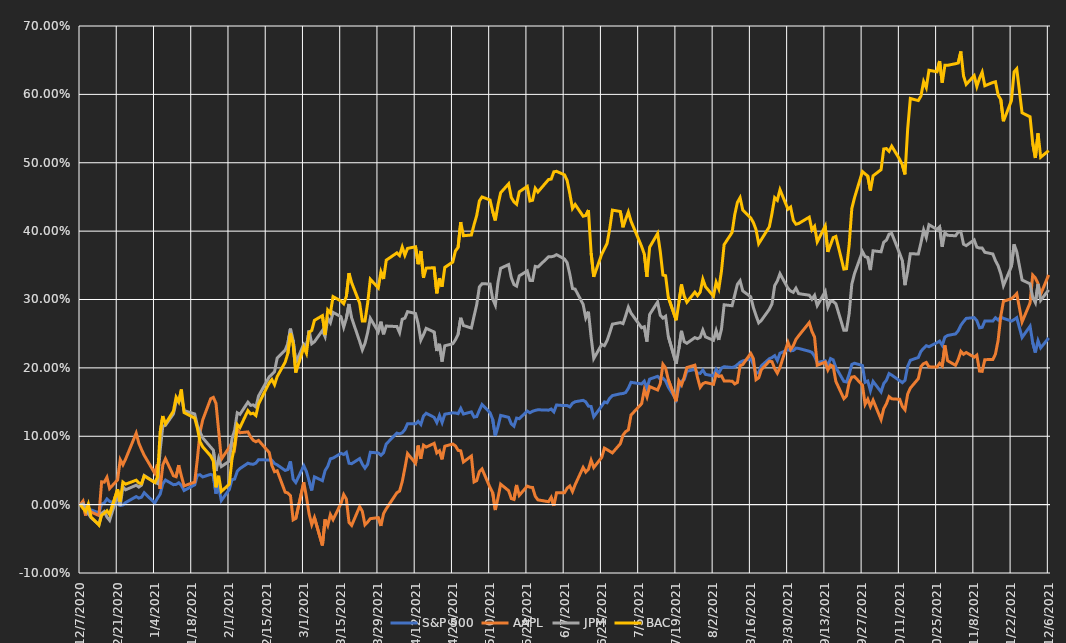
| Category | S&P 500 | AAPL | JPM | BAC |
|---|---|---|---|---|
| 12/6/21 | 0.244 | 0.336 | 0.314 | 0.518 |
| 12/3/21 | 0.229 | 0.308 | 0.299 | 0.508 |
| 12/2/21 | 0.24 | 0.323 | 0.323 | 0.543 |
| 12/1/21 | 0.222 | 0.331 | 0.295 | 0.507 |
| 11/30/21 | 0.237 | 0.336 | 0.303 | 0.529 |
| 11/29/21 | 0.261 | 0.295 | 0.323 | 0.567 |
| 11/26/21 | 0.244 | 0.267 | 0.329 | 0.573 |
| 11/24/21 | 0.273 | 0.309 | 0.37 | 0.637 |
| 11/23/21 | 0.271 | 0.304 | 0.381 | 0.633 |
| 11/22/21 | 0.268 | 0.301 | 0.348 | 0.591 |
| 11/19/21 | 0.272 | 0.297 | 0.32 | 0.561 |
| 11/18/21 | 0.274 | 0.276 | 0.338 | 0.592 |
| 11/17/21 | 0.27 | 0.24 | 0.349 | 0.599 |
| 11/16/21 | 0.273 | 0.22 | 0.357 | 0.618 |
| 11/15/21 | 0.268 | 0.212 | 0.367 | 0.617 |
| 11/12/21 | 0.268 | 0.212 | 0.369 | 0.613 |
| 11/11/21 | 0.259 | 0.195 | 0.375 | 0.633 |
| 11/10/21 | 0.259 | 0.195 | 0.375 | 0.624 |
| 11/9/21 | 0.269 | 0.219 | 0.377 | 0.612 |
| 11/8/21 | 0.273 | 0.216 | 0.387 | 0.627 |
| 11/5/21 | 0.272 | 0.222 | 0.379 | 0.615 |
| 11/4/21 | 0.268 | 0.22 | 0.381 | 0.627 |
| 11/3/21 | 0.262 | 0.224 | 0.399 | 0.663 |
| 11/2/21 | 0.254 | 0.212 | 0.399 | 0.646 |
| 11/1/21 | 0.25 | 0.204 | 0.393 | 0.645 |
| 10/29/21 | 0.247 | 0.211 | 0.394 | 0.642 |
| 10/28/21 | 0.245 | 0.233 | 0.398 | 0.642 |
| 10/27/21 | 0.233 | 0.203 | 0.377 | 0.617 |
| 10/26/21 | 0.239 | 0.207 | 0.406 | 0.649 |
| 10/25/21 | 0.237 | 0.201 | 0.403 | 0.633 |
| 10/22/21 | 0.231 | 0.202 | 0.409 | 0.635 |
| 10/21/21 | 0.232 | 0.208 | 0.391 | 0.61 |
| 10/20/21 | 0.229 | 0.206 | 0.402 | 0.619 |
| 10/19/21 | 0.224 | 0.202 | 0.383 | 0.598 |
| 10/18/21 | 0.215 | 0.184 | 0.367 | 0.591 |
| 10/15/21 | 0.211 | 0.17 | 0.367 | 0.594 |
| 10/14/21 | 0.202 | 0.162 | 0.341 | 0.549 |
| 10/13/21 | 0.182 | 0.139 | 0.321 | 0.483 |
| 10/12/21 | 0.178 | 0.144 | 0.357 | 0.497 |
| 10/11/21 | 0.181 | 0.154 | 0.367 | 0.505 |
| 10/8/21 | 0.189 | 0.155 | 0.397 | 0.524 |
| 10/7/21 | 0.192 | 0.158 | 0.396 | 0.517 |
| 10/6/21 | 0.182 | 0.147 | 0.387 | 0.521 |
| 10/5/21 | 0.177 | 0.14 | 0.384 | 0.52 |
| 10/4/21 | 0.165 | 0.124 | 0.37 | 0.49 |
| 10/1/21 | 0.18 | 0.153 | 0.371 | 0.481 |
| 9/30/21 | 0.167 | 0.143 | 0.343 | 0.459 |
| 9/29/21 | 0.181 | 0.154 | 0.362 | 0.481 |
| 9/28/21 | 0.179 | 0.147 | 0.363 | 0.484 |
| 9/27/21 | 0.203 | 0.175 | 0.37 | 0.487 |
| 9/24/21 | 0.207 | 0.187 | 0.338 | 0.449 |
| 9/23/21 | 0.205 | 0.187 | 0.322 | 0.433 |
| 9/22/21 | 0.191 | 0.179 | 0.279 | 0.38 |
| 9/21/21 | 0.179 | 0.159 | 0.255 | 0.345 |
| 9/20/21 | 0.18 | 0.155 | 0.255 | 0.344 |
| 9/17/21 | 0.201 | 0.18 | 0.294 | 0.392 |
| 9/16/21 | 0.212 | 0.202 | 0.297 | 0.391 |
| 9/15/21 | 0.214 | 0.204 | 0.298 | 0.38 |
| 9/14/21 | 0.203 | 0.197 | 0.289 | 0.37 |
| 9/13/21 | 0.21 | 0.208 | 0.312 | 0.407 |
| 9/10/21 | 0.208 | 0.204 | 0.291 | 0.384 |
| 9/9/21 | 0.217 | 0.245 | 0.306 | 0.407 |
| 9/8/21 | 0.223 | 0.253 | 0.3 | 0.402 |
| 9/7/21 | 0.224 | 0.266 | 0.306 | 0.42 |
| 9/3/21 | 0.228 | 0.247 | 0.309 | 0.411 |
| 9/2/21 | 0.229 | 0.242 | 0.317 | 0.41 |
| 9/1/21 | 0.225 | 0.232 | 0.31 | 0.416 |
| 8/31/21 | 0.225 | 0.227 | 0.312 | 0.435 |
| 8/30/21 | 0.227 | 0.237 | 0.316 | 0.432 |
| 8/27/21 | 0.221 | 0.201 | 0.338 | 0.461 |
| 8/26/21 | 0.211 | 0.192 | 0.327 | 0.445 |
| 8/25/21 | 0.218 | 0.199 | 0.32 | 0.449 |
| 8/24/21 | 0.215 | 0.209 | 0.294 | 0.426 |
| 8/23/21 | 0.213 | 0.21 | 0.286 | 0.406 |
| 8/20/21 | 0.203 | 0.197 | 0.269 | 0.388 |
| 8/19/21 | 0.193 | 0.185 | 0.266 | 0.382 |
| 8/18/21 | 0.192 | 0.183 | 0.277 | 0.402 |
| 8/17/21 | 0.205 | 0.214 | 0.288 | 0.413 |
| 8/16/21 | 0.213 | 0.221 | 0.304 | 0.419 |
| 8/13/21 | 0.21 | 0.205 | 0.313 | 0.431 |
| 8/12/21 | 0.208 | 0.203 | 0.327 | 0.449 |
| 8/11/21 | 0.205 | 0.179 | 0.322 | 0.442 |
| 8/10/21 | 0.202 | 0.177 | 0.307 | 0.424 |
| 8/9/21 | 0.201 | 0.181 | 0.291 | 0.398 |
| 8/6/21 | 0.202 | 0.181 | 0.292 | 0.38 |
| 8/5/21 | 0.2 | 0.188 | 0.257 | 0.341 |
| 8/4/21 | 0.192 | 0.187 | 0.241 | 0.316 |
| 8/3/21 | 0.198 | 0.191 | 0.254 | 0.325 |
| 8/2/21 | 0.188 | 0.176 | 0.24 | 0.305 |
| 7/30/21 | 0.19 | 0.179 | 0.245 | 0.319 |
| 7/29/21 | 0.197 | 0.177 | 0.255 | 0.33 |
| 7/28/21 | 0.192 | 0.172 | 0.245 | 0.311 |
| 7/27/21 | 0.192 | 0.186 | 0.243 | 0.306 |
| 7/26/21 | 0.198 | 0.204 | 0.244 | 0.311 |
| 7/23/21 | 0.195 | 0.2 | 0.236 | 0.296 |
| 7/22/21 | 0.183 | 0.186 | 0.238 | 0.305 |
| 7/21/21 | 0.181 | 0.175 | 0.254 | 0.322 |
| 7/20/21 | 0.171 | 0.181 | 0.228 | 0.296 |
| 7/19/21 | 0.153 | 0.151 | 0.206 | 0.27 |
| 7/16/21 | 0.172 | 0.183 | 0.246 | 0.304 |
| 7/15/21 | 0.181 | 0.2 | 0.276 | 0.335 |
| 7/14/21 | 0.185 | 0.205 | 0.273 | 0.336 |
| 7/13/21 | 0.183 | 0.177 | 0.277 | 0.37 |
| 7/12/21 | 0.188 | 0.168 | 0.296 | 0.397 |
| 7/9/21 | 0.184 | 0.173 | 0.278 | 0.376 |
| 7/8/21 | 0.17 | 0.157 | 0.238 | 0.333 |
| 7/7/21 | 0.18 | 0.168 | 0.26 | 0.366 |
| 7/6/21 | 0.176 | 0.148 | 0.259 | 0.377 |
| 7/2/21 | 0.179 | 0.131 | 0.28 | 0.415 |
| 7/1/21 | 0.17 | 0.109 | 0.289 | 0.428 |
| 6/30/21 | 0.164 | 0.107 | 0.276 | 0.417 |
| 6/29/21 | 0.162 | 0.102 | 0.265 | 0.406 |
| 6/28/21 | 0.162 | 0.089 | 0.266 | 0.429 |
| 6/25/21 | 0.159 | 0.076 | 0.264 | 0.431 |
| 6/24/21 | 0.156 | 0.078 | 0.251 | 0.404 |
| 6/23/21 | 0.149 | 0.08 | 0.24 | 0.382 |
| 6/22/21 | 0.15 | 0.083 | 0.232 | 0.374 |
| 6/21/21 | 0.144 | 0.069 | 0.234 | 0.366 |
| 6/18/21 | 0.129 | 0.054 | 0.214 | 0.333 |
| 6/17/21 | 0.144 | 0.065 | 0.245 | 0.368 |
| 6/16/21 | 0.144 | 0.052 | 0.282 | 0.431 |
| 6/15/21 | 0.15 | 0.048 | 0.273 | 0.423 |
| 6/14/21 | 0.153 | 0.054 | 0.293 | 0.422 |
| 6/11/21 | 0.15 | 0.029 | 0.315 | 0.439 |
| 6/10/21 | 0.148 | 0.019 | 0.316 | 0.433 |
| 6/9/21 | 0.143 | 0.027 | 0.337 | 0.455 |
| 6/8/21 | 0.145 | 0.024 | 0.354 | 0.474 |
| 6/7/21 | 0.145 | 0.017 | 0.359 | 0.482 |
| 6/4/21 | 0.146 | 0.017 | 0.366 | 0.487 |
| 6/3/21 | 0.136 | -0.002 | 0.363 | 0.487 |
| 6/2/21 | 0.14 | 0.011 | 0.362 | 0.476 |
| 6/1/21 | 0.138 | 0.004 | 0.362 | 0.475 |
| 5/28/21 | 0.139 | 0.007 | 0.348 | 0.457 |
| 5/27/21 | 0.138 | 0.012 | 0.348 | 0.463 |
| 5/26/21 | 0.137 | 0.025 | 0.328 | 0.445 |
| 5/25/21 | 0.134 | 0.025 | 0.328 | 0.444 |
| 5/24/21 | 0.137 | 0.027 | 0.342 | 0.465 |
| 5/21/21 | 0.126 | 0.014 | 0.335 | 0.458 |
| 5/20/21 | 0.127 | 0.029 | 0.32 | 0.439 |
| 5/19/21 | 0.115 | 0.008 | 0.322 | 0.443 |
| 5/18/21 | 0.118 | 0.009 | 0.332 | 0.449 |
| 5/17/21 | 0.128 | 0.02 | 0.351 | 0.469 |
| 5/14/21 | 0.131 | 0.03 | 0.346 | 0.456 |
| 5/13/21 | 0.114 | 0.01 | 0.325 | 0.438 |
| 5/12/21 | 0.101 | -0.008 | 0.292 | 0.416 |
| 5/11/21 | 0.125 | 0.017 | 0.301 | 0.429 |
| 5/10/21 | 0.134 | 0.025 | 0.323 | 0.446 |
| 5/7/21 | 0.146 | 0.052 | 0.323 | 0.45 |
| 5/6/21 | 0.138 | 0.048 | 0.318 | 0.444 |
| 5/5/21 | 0.129 | 0.035 | 0.292 | 0.423 |
| 5/4/21 | 0.128 | 0.033 | 0.276 | 0.409 |
| 5/3/21 | 0.136 | 0.071 | 0.258 | 0.394 |
| 4/30/21 | 0.133 | 0.062 | 0.262 | 0.393 |
| 4/29/21 | 0.141 | 0.079 | 0.273 | 0.413 |
| 4/28/21 | 0.133 | 0.079 | 0.249 | 0.376 |
| 4/27/21 | 0.134 | 0.086 | 0.241 | 0.371 |
| 4/26/21 | 0.134 | 0.089 | 0.235 | 0.355 |
| 4/23/21 | 0.132 | 0.085 | 0.232 | 0.347 |
| 4/22/21 | 0.12 | 0.066 | 0.209 | 0.319 |
| 4/21/21 | 0.13 | 0.079 | 0.235 | 0.331 |
| 4/20/21 | 0.12 | 0.076 | 0.225 | 0.309 |
| 4/19/21 | 0.128 | 0.09 | 0.252 | 0.347 |
| 4/16/21 | 0.134 | 0.084 | 0.258 | 0.346 |
| 4/15/21 | 0.13 | 0.087 | 0.249 | 0.332 |
| 4/14/21 | 0.117 | 0.067 | 0.241 | 0.371 |
| 4/13/21 | 0.122 | 0.086 | 0.264 | 0.352 |
| 4/12/21 | 0.118 | 0.061 | 0.28 | 0.377 |
| 4/9/21 | 0.118 | 0.075 | 0.282 | 0.375 |
| 4/8/21 | 0.11 | 0.053 | 0.273 | 0.365 |
| 4/7/21 | 0.105 | 0.034 | 0.271 | 0.377 |
| 4/6/21 | 0.103 | 0.02 | 0.252 | 0.364 |
| 4/5/21 | 0.105 | 0.017 | 0.26 | 0.368 |
| 4/1/21 | 0.089 | -0.006 | 0.261 | 0.358 |
| 3/31/21 | 0.076 | -0.013 | 0.249 | 0.33 |
| 3/30/21 | 0.072 | -0.031 | 0.267 | 0.34 |
| 3/29/21 | 0.076 | -0.019 | 0.253 | 0.317 |
| 3/26/21 | 0.077 | -0.021 | 0.272 | 0.33 |
| 3/25/21 | 0.059 | -0.026 | 0.252 | 0.295 |
| 3/24/21 | 0.053 | -0.03 | 0.236 | 0.268 |
| 3/23/21 | 0.059 | -0.01 | 0.226 | 0.268 |
| 3/22/21 | 0.067 | -0.003 | 0.239 | 0.295 |
| 3/19/21 | 0.06 | -0.03 | 0.273 | 0.325 |
| 3/18/21 | 0.061 | -0.026 | 0.293 | 0.339 |
| 3/17/21 | 0.076 | 0.008 | 0.272 | 0.305 |
| 3/16/21 | 0.073 | 0.015 | 0.26 | 0.294 |
| 3/15/21 | 0.075 | 0.002 | 0.275 | 0.298 |
| 3/12/21 | 0.068 | -0.022 | 0.281 | 0.304 |
| 3/11/21 | 0.067 | -0.014 | 0.266 | 0.28 |
| 3/10/21 | 0.056 | -0.03 | 0.273 | 0.285 |
| 3/9/21 | 0.05 | -0.022 | 0.246 | 0.249 |
| 3/8/21 | 0.035 | -0.06 | 0.255 | 0.276 |
| 3/5/21 | 0.041 | -0.019 | 0.238 | 0.27 |
| 3/4/21 | 0.021 | -0.029 | 0.235 | 0.255 |
| 3/3/21 | 0.035 | -0.014 | 0.255 | 0.252 |
| 3/2/21 | 0.048 | 0.011 | 0.231 | 0.221 |
| 3/1/21 | 0.057 | 0.033 | 0.235 | 0.23 |
| 2/26/21 | 0.032 | -0.02 | 0.207 | 0.193 |
| 2/25/21 | 0.037 | -0.022 | 0.24 | 0.235 |
| 2/24/21 | 0.063 | 0.013 | 0.257 | 0.251 |
| 2/23/21 | 0.051 | 0.017 | 0.236 | 0.221 |
| 2/22/21 | 0.05 | 0.018 | 0.226 | 0.208 |
| 2/19/21 | 0.058 | 0.049 | 0.214 | 0.187 |
| 2/18/21 | 0.06 | 0.048 | 0.195 | 0.175 |
| 2/17/21 | 0.065 | 0.057 | 0.191 | 0.183 |
| 2/16/21 | 0.065 | 0.076 | 0.187 | 0.178 |
| 2/12/21 | 0.066 | 0.094 | 0.159 | 0.147 |
| 2/11/21 | 0.061 | 0.092 | 0.143 | 0.13 |
| 2/10/21 | 0.059 | 0.094 | 0.146 | 0.134 |
| 2/9/21 | 0.059 | 0.099 | 0.145 | 0.133 |
| 2/8/21 | 0.061 | 0.106 | 0.15 | 0.138 |
| 2/5/21 | 0.053 | 0.105 | 0.132 | 0.113 |
| 2/4/21 | 0.049 | 0.11 | 0.134 | 0.117 |
| 2/3/21 | 0.037 | 0.082 | 0.109 | 0.086 |
| 2/2/21 | 0.036 | 0.091 | 0.096 | 0.067 |
| 2/1/21 | 0.022 | 0.084 | 0.064 | 0.03 |
| 1/29/21 | 0.006 | 0.066 | 0.056 | 0.019 |
| 1/28/21 | 0.026 | 0.108 | 0.068 | 0.042 |
| 1/27/21 | 0.016 | 0.148 | 0.049 | 0.025 |
| 1/26/21 | 0.043 | 0.157 | 0.08 | 0.064 |
| 1/25/21 | 0.044 | 0.155 | 0.084 | 0.071 |
| 1/22/21 | 0.04 | 0.124 | 0.098 | 0.085 |
| 1/21/21 | 0.044 | 0.106 | 0.106 | 0.092 |
| 1/20/21 | 0.043 | 0.067 | 0.116 | 0.112 |
| 1/19/21 | 0.029 | 0.033 | 0.133 | 0.127 |
| 1/15/21 | 0.021 | 0.027 | 0.138 | 0.135 |
| 1/14/21 | 0.028 | 0.042 | 0.158 | 0.168 |
| 1/13/21 | 0.032 | 0.058 | 0.152 | 0.15 |
| 1/12/21 | 0.03 | 0.041 | 0.15 | 0.157 |
| 1/11/21 | 0.029 | 0.042 | 0.133 | 0.137 |
| 1/8/21 | 0.036 | 0.067 | 0.116 | 0.118 |
| 1/7/21 | 0.03 | 0.058 | 0.115 | 0.13 |
| 1/6/21 | 0.015 | 0.023 | 0.079 | 0.105 |
| 1/5/21 | 0.009 | 0.059 | 0.031 | 0.04 |
| 1/4/21 | 0.002 | 0.046 | 0.033 | 0.032 |
| 12/31/20 | 0.017 | 0.072 | 0.043 | 0.042 |
| 12/30/20 | 0.011 | 0.081 | 0.029 | 0.031 |
| 12/29/20 | 0.01 | 0.09 | 0.026 | 0.032 |
| 12/28/20 | 0.012 | 0.105 | 0.028 | 0.036 |
| 12/24/20 | 0.003 | 0.066 | 0.022 | 0.03 |
| 12/23/20 | -0.001 | 0.058 | 0.026 | 0.033 |
| 12/22/20 | -0.001 | 0.066 | -0.002 | 0.004 |
| 12/21/20 | 0.001 | 0.036 | 0.014 | 0.022 |
| 12/18/20 | 0.005 | 0.023 | -0.023 | -0.014 |
| 12/17/20 | 0.008 | 0.04 | -0.018 | -0.009 |
| 12/16/20 | 0.002 | 0.033 | -0.01 | -0.013 |
| 12/15/20 | 0.001 | 0.033 | -0.013 | -0.015 |
| 12/14/20 | -0.012 | -0.016 | -0.029 | -0.03 |
| 12/11/20 | -0.008 | -0.011 | -0.019 | -0.018 |
| 12/10/20 | -0.006 | -0.004 | -0.013 | 0.001 |
| 12/9/20 | -0.005 | -0.016 | -0.007 | -0.01 |
| 12/8/20 | 0.003 | 0.005 | 0.001 | -0.006 |
| 12/7/20 | 0 | 0 | 0 | 0 |